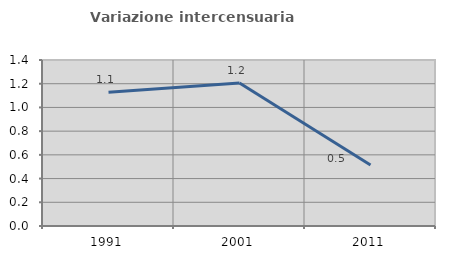
| Category | Variazione intercensuaria annua |
|---|---|
| 1991.0 | 1.127 |
| 2001.0 | 1.206 |
| 2011.0 | 0.514 |